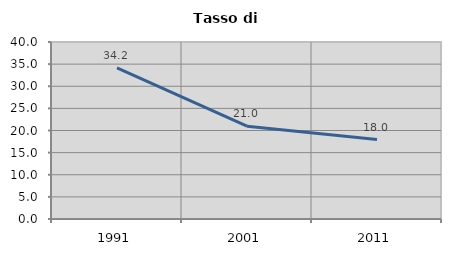
| Category | Tasso di disoccupazione   |
|---|---|
| 1991.0 | 34.155 |
| 2001.0 | 20.976 |
| 2011.0 | 17.96 |